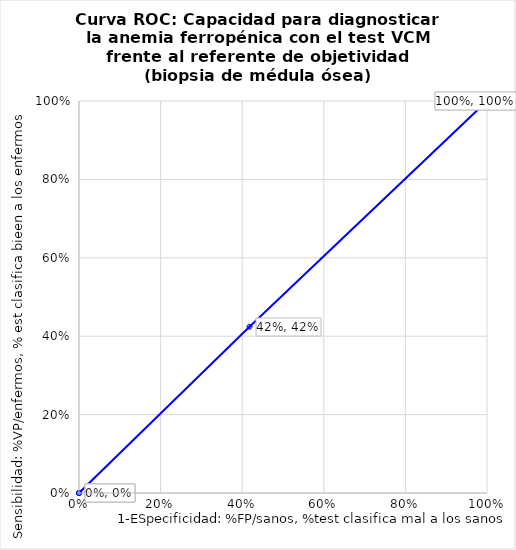
| Category | Sensibilidad |
|---|---|
| 1.0 | 1 |
| 1.0 | 1 |
| 0.417910447761194 | 0.424 |
| 0.0 | 0 |
| 0.0 | 0 |
| 0.0 | 0 |